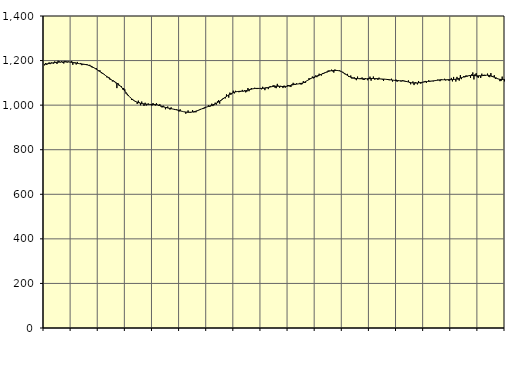
| Category | Piggar | Series 1 |
|---|---|---|
| nan | 1178.6 | 1183.67 |
| 87.0 | 1188.8 | 1184.08 |
| 87.0 | 1181 | 1184.98 |
| 87.0 | 1186.4 | 1185.97 |
| 87.0 | 1191.8 | 1186.86 |
| 87.0 | 1184 | 1187.71 |
| 87.0 | 1191.6 | 1188.55 |
| 87.0 | 1188.4 | 1189.47 |
| 87.0 | 1186.3 | 1190.31 |
| 87.0 | 1196.2 | 1191.06 |
| 87.0 | 1190.5 | 1191.72 |
| 87.0 | 1184.8 | 1192.27 |
| nan | 1199.2 | 1192.73 |
| 88.0 | 1196.5 | 1193.09 |
| 88.0 | 1191.7 | 1193.4 |
| 88.0 | 1196.5 | 1193.7 |
| 88.0 | 1190.9 | 1193.93 |
| 88.0 | 1186.8 | 1194.12 |
| 88.0 | 1198.4 | 1194.22 |
| 88.0 | 1196.6 | 1194.21 |
| 88.0 | 1191.3 | 1194.07 |
| 88.0 | 1196 | 1193.78 |
| 88.0 | 1194.1 | 1193.33 |
| 88.0 | 1194.1 | 1192.78 |
| nan | 1198.1 | 1192.1 |
| 89.0 | 1181 | 1191.28 |
| 89.0 | 1191.5 | 1190.36 |
| 89.0 | 1191.8 | 1189.4 |
| 89.0 | 1182.4 | 1188.45 |
| 89.0 | 1193.9 | 1187.56 |
| 89.0 | 1185.4 | 1186.74 |
| 89.0 | 1186.4 | 1185.98 |
| 89.0 | 1189.2 | 1185.3 |
| 89.0 | 1179.4 | 1184.68 |
| 89.0 | 1182.2 | 1184.05 |
| 89.0 | 1184.1 | 1183.34 |
| nan | 1180 | 1182.48 |
| 90.0 | 1184.5 | 1181.46 |
| 90.0 | 1181.9 | 1180.22 |
| 90.0 | 1177.4 | 1178.7 |
| 90.0 | 1180.9 | 1176.88 |
| 90.0 | 1176.3 | 1174.77 |
| 90.0 | 1169.2 | 1172.35 |
| 90.0 | 1168.2 | 1169.69 |
| 90.0 | 1166.4 | 1166.84 |
| 90.0 | 1161.8 | 1163.88 |
| 90.0 | 1165 | 1160.83 |
| 90.0 | 1156.9 | 1157.71 |
| nan | 1152 | 1154.51 |
| 91.0 | 1156.1 | 1151.23 |
| 91.0 | 1146.4 | 1147.81 |
| 91.0 | 1141.4 | 1144.23 |
| 91.0 | 1141.5 | 1140.5 |
| 91.0 | 1138.7 | 1136.66 |
| 91.0 | 1133.6 | 1132.76 |
| 91.0 | 1124.9 | 1128.89 |
| 91.0 | 1126.9 | 1125.1 |
| 91.0 | 1124.9 | 1121.43 |
| 91.0 | 1113.7 | 1117.9 |
| 91.0 | 1115 | 1114.48 |
| nan | 1106.3 | 1111.13 |
| 92.0 | 1110.1 | 1107.87 |
| 92.0 | 1107.5 | 1104.65 |
| 92.0 | 1098.5 | 1101.44 |
| 92.0 | 1076.4 | 1098.12 |
| 92.0 | 1098.6 | 1094.52 |
| 92.0 | 1086.8 | 1090.55 |
| 92.0 | 1085.2 | 1086.1 |
| 92.0 | 1084.8 | 1081.11 |
| 92.0 | 1070.8 | 1075.58 |
| 92.0 | 1076.7 | 1069.6 |
| 92.0 | 1071 | 1063.37 |
| nan | 1052 | 1056.97 |
| 93.0 | 1047.8 | 1050.56 |
| 93.0 | 1041.1 | 1044.36 |
| 93.0 | 1038.7 | 1038.5 |
| 93.0 | 1034.3 | 1033.13 |
| 93.0 | 1023.3 | 1028.37 |
| 93.0 | 1027.8 | 1024.26 |
| 93.0 | 1021.8 | 1020.81 |
| 93.0 | 1017.2 | 1017.93 |
| 93.0 | 1015.6 | 1015.47 |
| 93.0 | 1005.3 | 1013.33 |
| 93.0 | 1020.2 | 1011.42 |
| nan | 1011.9 | 1009.77 |
| 94.0 | 999.4 | 1008.37 |
| 94.0 | 1016.1 | 1007.18 |
| 94.0 | 1007.6 | 1006.19 |
| 94.0 | 996.4 | 1005.35 |
| 94.0 | 1010.7 | 1004.65 |
| 94.0 | 998.2 | 1004.11 |
| 94.0 | 1005.9 | 1003.68 |
| 94.0 | 1006.9 | 1003.41 |
| 94.0 | 1004 | 1003.3 |
| 94.0 | 1001.5 | 1003.3 |
| 94.0 | 997.5 | 1003.3 |
| nan | 1009.5 | 1003.22 |
| 95.0 | 1001.3 | 1003.04 |
| 95.0 | 998.1 | 1002.64 |
| 95.0 | 1008.8 | 1001.92 |
| 95.0 | 1001.9 | 1000.92 |
| 95.0 | 996.5 | 999.65 |
| 95.0 | 1004.6 | 998.1 |
| 95.0 | 994 | 996.39 |
| 95.0 | 989.6 | 994.59 |
| 95.0 | 997.6 | 992.82 |
| 95.0 | 992.4 | 991.16 |
| 95.0 | 981.5 | 989.68 |
| nan | 991.3 | 988.4 |
| 96.0 | 993.8 | 987.25 |
| 96.0 | 986.8 | 986.2 |
| 96.0 | 980 | 985.19 |
| 96.0 | 990.1 | 984.17 |
| 96.0 | 983.2 | 983.13 |
| 96.0 | 981.6 | 982.09 |
| 96.0 | 978.4 | 981 |
| 96.0 | 978.7 | 979.85 |
| 96.0 | 981.4 | 978.59 |
| 96.0 | 977 | 977.25 |
| 96.0 | 971.4 | 975.9 |
| nan | 981.1 | 974.53 |
| 97.0 | 973.7 | 973.16 |
| 97.0 | 972.5 | 971.84 |
| 97.0 | 970.6 | 970.7 |
| 97.0 | 969 | 969.76 |
| 97.0 | 961.4 | 969 |
| 97.0 | 967.7 | 968.47 |
| 97.0 | 976.2 | 968.17 |
| 97.0 | 966.7 | 968.11 |
| 97.0 | 966 | 968.3 |
| 97.0 | 967.8 | 968.74 |
| 97.0 | 977.6 | 969.45 |
| nan | 967.8 | 970.4 |
| 98.0 | 968.1 | 971.55 |
| 98.0 | 968.1 | 972.92 |
| 98.0 | 975.8 | 974.53 |
| 98.0 | 977.4 | 976.4 |
| 98.0 | 980.1 | 978.46 |
| 98.0 | 983 | 980.66 |
| 98.0 | 982.9 | 982.91 |
| 98.0 | 982.4 | 985.09 |
| 98.0 | 983.6 | 987.21 |
| 98.0 | 992 | 989.17 |
| 98.0 | 990.6 | 990.92 |
| nan | 992.4 | 992.56 |
| 99.0 | 999.2 | 994.23 |
| 99.0 | 993.5 | 995.94 |
| 99.0 | 994.3 | 997.71 |
| 99.0 | 1006.5 | 999.53 |
| 99.0 | 995.8 | 1001.48 |
| 99.0 | 999.9 | 1003.55 |
| 99.0 | 1011.2 | 1005.81 |
| 99.0 | 1002 | 1008.38 |
| 99.0 | 1017 | 1011.24 |
| 99.0 | 1022 | 1014.38 |
| 99.0 | 1006.7 | 1017.74 |
| nan | 1018.4 | 1021.23 |
| 0.0 | 1026.5 | 1024.8 |
| 0.0 | 1031.1 | 1028.39 |
| 0.0 | 1033.1 | 1031.98 |
| 0.0 | 1030.4 | 1035.54 |
| 0.0 | 1048.4 | 1039.05 |
| 0.0 | 1043.8 | 1042.53 |
| 0.0 | 1033.8 | 1045.87 |
| 0.0 | 1056.2 | 1048.95 |
| 0.0 | 1046.9 | 1051.73 |
| 0.0 | 1053 | 1054.13 |
| 0.0 | 1064.8 | 1056.21 |
| nan | 1052.7 | 1058.05 |
| 1.0 | 1064.3 | 1059.5 |
| 1.0 | 1062 | 1060.56 |
| 1.0 | 1061.5 | 1061.29 |
| 1.0 | 1057.9 | 1061.73 |
| 1.0 | 1059 | 1061.97 |
| 1.0 | 1062.1 | 1062.12 |
| 1.0 | 1068.4 | 1062.36 |
| 1.0 | 1061.5 | 1062.82 |
| 1.0 | 1066.6 | 1063.53 |
| 1.0 | 1057.3 | 1064.56 |
| 1.0 | 1060.1 | 1065.86 |
| nan | 1076.9 | 1067.3 |
| 2.0 | 1062.5 | 1068.86 |
| 2.0 | 1068.7 | 1070.35 |
| 2.0 | 1076.9 | 1071.69 |
| 2.0 | 1073.5 | 1072.88 |
| 2.0 | 1074.8 | 1073.86 |
| 2.0 | 1078.1 | 1074.55 |
| 2.0 | 1074.5 | 1074.97 |
| 2.0 | 1072.2 | 1075.13 |
| 2.0 | 1072.8 | 1075.13 |
| 2.0 | 1075 | 1075.06 |
| 2.0 | 1077.2 | 1075.02 |
| nan | 1071.1 | 1075.03 |
| 3.0 | 1082.3 | 1075.2 |
| 3.0 | 1077.7 | 1075.68 |
| 3.0 | 1067.2 | 1076.37 |
| 3.0 | 1080 | 1077.2 |
| 3.0 | 1079.3 | 1078.2 |
| 3.0 | 1071.9 | 1079.29 |
| 3.0 | 1083.3 | 1080.41 |
| 3.0 | 1084.5 | 1081.57 |
| 3.0 | 1081.6 | 1082.69 |
| 3.0 | 1087.8 | 1083.68 |
| 3.0 | 1089.6 | 1084.47 |
| nan | 1078 | 1084.97 |
| 4.0 | 1076.2 | 1085.13 |
| 4.0 | 1095.5 | 1085.01 |
| 4.0 | 1087 | 1084.75 |
| 4.0 | 1078.2 | 1084.44 |
| 4.0 | 1086.7 | 1084.06 |
| 4.0 | 1084.3 | 1083.76 |
| 4.0 | 1076.6 | 1083.61 |
| 4.0 | 1087.7 | 1083.65 |
| 4.0 | 1078 | 1083.91 |
| 4.0 | 1083.3 | 1084.44 |
| 4.0 | 1089.5 | 1085.22 |
| nan | 1090.4 | 1086.27 |
| 5.0 | 1083.9 | 1087.59 |
| 5.0 | 1081.2 | 1088.98 |
| 5.0 | 1093.9 | 1090.29 |
| 5.0 | 1100.2 | 1091.51 |
| 5.0 | 1095.9 | 1092.6 |
| 5.0 | 1090.8 | 1093.49 |
| 5.0 | 1097.7 | 1094.21 |
| 5.0 | 1095.1 | 1094.85 |
| 5.0 | 1095.8 | 1095.48 |
| 5.0 | 1099.9 | 1096.24 |
| 5.0 | 1092 | 1097.26 |
| nan | 1094.2 | 1098.69 |
| 6.0 | 1107.7 | 1100.58 |
| 6.0 | 1099.5 | 1102.97 |
| 6.0 | 1100.6 | 1105.77 |
| 6.0 | 1108.4 | 1108.75 |
| 6.0 | 1111.2 | 1111.79 |
| 6.0 | 1120.8 | 1114.81 |
| 6.0 | 1119.8 | 1117.68 |
| 6.0 | 1119.6 | 1120.31 |
| 6.0 | 1128.3 | 1122.7 |
| 6.0 | 1120.3 | 1124.85 |
| 6.0 | 1122.6 | 1126.83 |
| nan | 1133.6 | 1128.69 |
| 7.0 | 1125.4 | 1130.48 |
| 7.0 | 1129.8 | 1132.26 |
| 7.0 | 1141 | 1134.15 |
| 7.0 | 1138.8 | 1136.2 |
| 7.0 | 1132.8 | 1138.42 |
| 7.0 | 1143.5 | 1140.75 |
| 7.0 | 1140 | 1143.09 |
| 7.0 | 1143.6 | 1145.36 |
| 7.0 | 1147.8 | 1147.48 |
| 7.0 | 1146.9 | 1149.38 |
| 7.0 | 1155.5 | 1151.06 |
| nan | 1155.1 | 1152.48 |
| 8.0 | 1154.6 | 1153.63 |
| 8.0 | 1159.3 | 1154.53 |
| 8.0 | 1151.4 | 1155.2 |
| 8.0 | 1146.1 | 1155.63 |
| 8.0 | 1160.1 | 1155.83 |
| 8.0 | 1155.9 | 1155.81 |
| 8.0 | 1157 | 1155.48 |
| 8.0 | 1155.6 | 1154.78 |
| 8.0 | 1155.9 | 1153.63 |
| 8.0 | 1153.7 | 1151.98 |
| 8.0 | 1149.7 | 1149.77 |
| nan | 1149.4 | 1147.03 |
| 9.0 | 1142.8 | 1143.91 |
| 9.0 | 1138.2 | 1140.51 |
| 9.0 | 1136.4 | 1137.02 |
| 9.0 | 1140.3 | 1133.66 |
| 9.0 | 1127.5 | 1130.54 |
| 9.0 | 1129.4 | 1127.69 |
| 9.0 | 1132.9 | 1125.26 |
| 9.0 | 1119 | 1123.29 |
| 9.0 | 1120.9 | 1121.79 |
| 9.0 | 1125.4 | 1120.68 |
| 9.0 | 1116.1 | 1119.93 |
| nan | 1112 | 1119.45 |
| 10.0 | 1128.1 | 1119.11 |
| 10.0 | 1117.9 | 1118.88 |
| 10.0 | 1116.9 | 1118.72 |
| 10.0 | 1121.9 | 1118.54 |
| 10.0 | 1124.1 | 1118.35 |
| 10.0 | 1113.1 | 1118.22 |
| 10.0 | 1113.7 | 1118.15 |
| 10.0 | 1121.3 | 1118.19 |
| 10.0 | 1118.8 | 1118.33 |
| 10.0 | 1111.8 | 1118.54 |
| 10.0 | 1121.7 | 1118.79 |
| nan | 1127.9 | 1119.1 |
| 11.0 | 1109.8 | 1119.37 |
| 11.0 | 1121 | 1119.51 |
| 11.0 | 1128.3 | 1119.52 |
| 11.0 | 1115 | 1119.39 |
| 11.0 | 1116 | 1119.13 |
| 11.0 | 1120.9 | 1118.79 |
| 11.0 | 1113.4 | 1118.46 |
| 11.0 | 1123.4 | 1118.1 |
| 11.0 | 1118 | 1117.76 |
| 11.0 | 1116.7 | 1117.46 |
| 11.0 | 1115 | 1117.18 |
| nan | 1108.6 | 1116.83 |
| 12.0 | 1117.5 | 1116.42 |
| 12.0 | 1115.8 | 1115.99 |
| 12.0 | 1114.7 | 1115.45 |
| 12.0 | 1116.7 | 1114.85 |
| 12.0 | 1111.9 | 1114.25 |
| 12.0 | 1114.2 | 1113.64 |
| 12.0 | 1118.5 | 1112.98 |
| 12.0 | 1105.7 | 1112.32 |
| 12.0 | 1111.7 | 1111.66 |
| 12.0 | 1111.6 | 1111.06 |
| 12.0 | 1114.9 | 1110.53 |
| nan | 1105 | 1110.09 |
| 13.0 | 1112.4 | 1109.78 |
| 13.0 | 1109.3 | 1109.57 |
| 13.0 | 1107 | 1109.38 |
| 13.0 | 1106.7 | 1109.16 |
| 13.0 | 1112.2 | 1108.8 |
| 13.0 | 1109.7 | 1108.24 |
| 13.0 | 1106.2 | 1107.46 |
| 13.0 | 1108 | 1106.44 |
| 13.0 | 1105.5 | 1105.23 |
| 13.0 | 1110.9 | 1103.9 |
| 13.0 | 1099.8 | 1102.57 |
| nan | 1093.5 | 1101.35 |
| 14.0 | 1100.2 | 1100.34 |
| 14.0 | 1106.3 | 1099.56 |
| 14.0 | 1090 | 1099.12 |
| 14.0 | 1103.6 | 1099.03 |
| 14.0 | 1100.6 | 1099.21 |
| 14.0 | 1093.1 | 1099.61 |
| 14.0 | 1108.4 | 1100.19 |
| 14.0 | 1102.1 | 1100.89 |
| 14.0 | 1096 | 1101.65 |
| 14.0 | 1102 | 1102.42 |
| 14.0 | 1102.4 | 1103.2 |
| nan | 1106.6 | 1103.99 |
| 15.0 | 1108.6 | 1104.74 |
| 15.0 | 1099.8 | 1105.42 |
| 15.0 | 1106.2 | 1106.05 |
| 15.0 | 1111.9 | 1106.68 |
| 15.0 | 1105.2 | 1107.26 |
| 15.0 | 1107.8 | 1107.83 |
| 15.0 | 1108 | 1108.4 |
| 15.0 | 1106.7 | 1108.97 |
| 15.0 | 1110.7 | 1109.61 |
| 15.0 | 1108.7 | 1110.34 |
| 15.0 | 1112.1 | 1111.12 |
| nan | 1114.7 | 1111.9 |
| 16.0 | 1113.3 | 1112.58 |
| 16.0 | 1107.5 | 1113.17 |
| 16.0 | 1116.3 | 1113.59 |
| 16.0 | 1114.5 | 1113.82 |
| 16.0 | 1113.9 | 1113.93 |
| 16.0 | 1118.3 | 1113.95 |
| 16.0 | 1110.8 | 1113.94 |
| 16.0 | 1114.5 | 1113.99 |
| 16.0 | 1115 | 1114.04 |
| 16.0 | 1108.6 | 1114.11 |
| 16.0 | 1112.7 | 1114.25 |
| nan | 1122.2 | 1114.43 |
| 17.0 | 1106.6 | 1114.72 |
| 17.0 | 1126.5 | 1115.13 |
| 17.0 | 1114.6 | 1115.72 |
| 17.0 | 1106 | 1116.47 |
| 17.0 | 1126.8 | 1117.4 |
| 17.0 | 1114.3 | 1118.56 |
| 17.0 | 1110 | 1119.92 |
| 17.0 | 1134.8 | 1121.39 |
| 17.0 | 1116.7 | 1123.02 |
| 17.0 | 1124.5 | 1124.72 |
| 17.0 | 1130.4 | 1126.37 |
| nan | 1125 | 1127.9 |
| 18.0 | 1133.4 | 1129.3 |
| 18.0 | 1128.1 | 1130.54 |
| 18.0 | 1132.2 | 1131.58 |
| 18.0 | 1135 | 1132.39 |
| 18.0 | 1121.9 | 1132.91 |
| 18.0 | 1138.3 | 1133.08 |
| 18.0 | 1146.8 | 1133.01 |
| 18.0 | 1115.4 | 1132.75 |
| 18.0 | 1139.1 | 1132.31 |
| 18.0 | 1143.5 | 1131.88 |
| 18.0 | 1125 | 1131.58 |
| nan | 1123.4 | 1131.41 |
| 19.0 | 1133.1 | 1131.45 |
| 19.0 | 1121.9 | 1131.7 |
| 19.0 | 1141.2 | 1132.15 |
| 19.0 | 1132.9 | 1132.73 |
| 19.0 | 1136.4 | 1133.37 |
| 19.0 | 1130.8 | 1133.93 |
| 19.0 | 1134.1 | 1134.23 |
| 19.0 | 1141.5 | 1134.21 |
| 19.0 | 1127.8 | 1133.86 |
| 19.0 | 1125.5 | 1132.95 |
| 19.0 | 1143.8 | 1131.51 |
| nan | 1126.8 | 1129.72 |
| 20.0 | 1125.6 | 1127.63 |
| 20.0 | 1134.2 | 1125.31 |
| 20.0 | 1117.6 | 1122.94 |
| 20.0 | 1122.8 | 1120.64 |
| 20.0 | 1117.1 | 1118.59 |
| 20.0 | 1117.3 | 1116.94 |
| 20.0 | 1107.7 | 1115.77 |
| 20.0 | 1108.1 | 1115.1 |
| 20.0 | 1128 | 1114.9 |
| 20.0 | 1114.8 | 1115.16 |
| 20.0 | 1106.8 | 1115.72 |